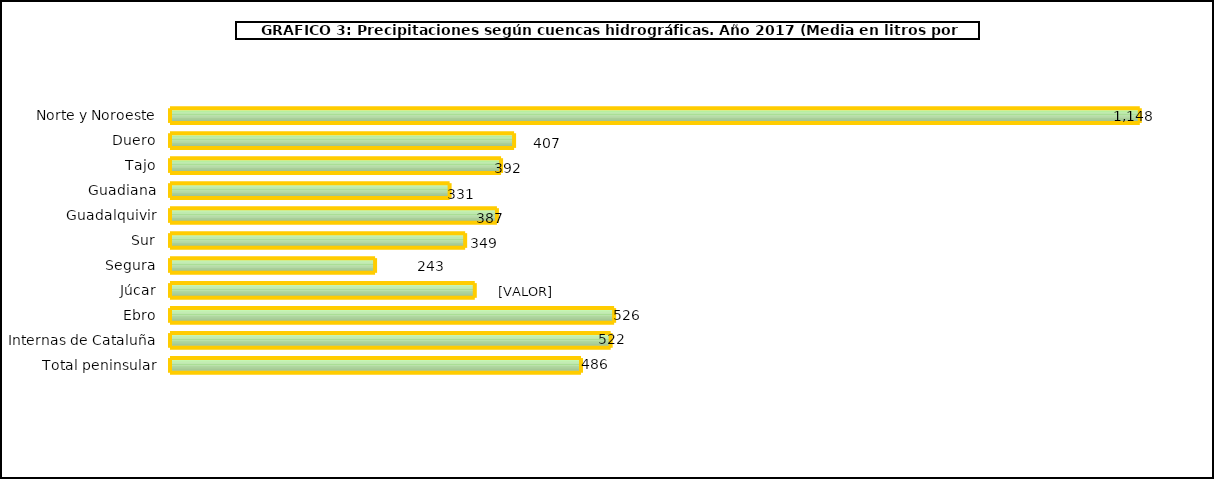
| Category | cuencas |
|---|---|
| 0 | 1147.7 |
| 1 | 407.2 |
| 2 | 391.8 |
| 3 | 330.9 |
| 4 | 386.9 |
| 5 | 349.3 |
| 6 | 242.7 |
| 7 | 360.7 |
| 8 | 525.6 |
| 9 | 521.5 |
| 10 | 486.4 |